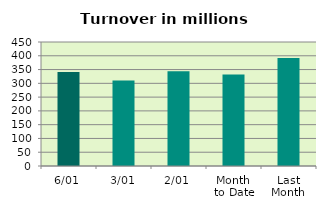
| Category | Series 0 |
|---|---|
| 6/01 | 341.522 |
| 3/01 | 309.97 |
| 2/01 | 343.533 |
| Month 
to Date | 331.675 |
| Last
Month | 391.769 |